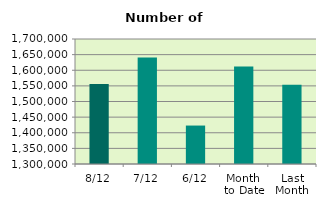
| Category | Series 0 |
|---|---|
| 8/12 | 1555798 |
| 7/12 | 1641010 |
| 6/12 | 1423036 |
| Month 
to Date | 1612143 |
| Last
Month | 1553278.182 |